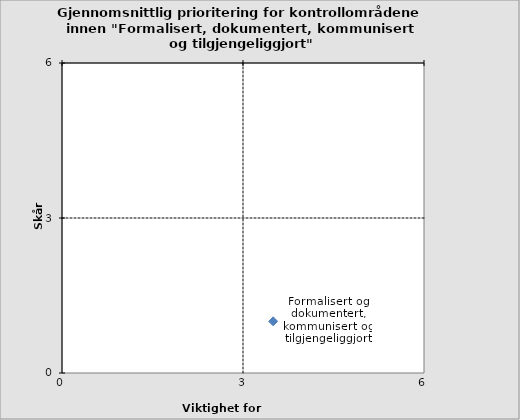
| Category | Formalisert og dokumentert, kommunisert og tilgjengeliggjort |
|---|---|
| 3.5 | 1 |